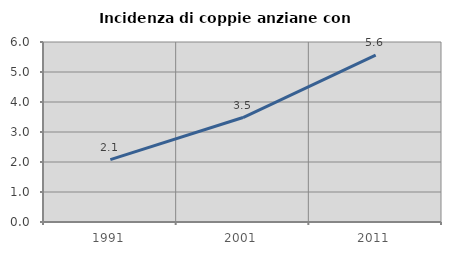
| Category | Incidenza di coppie anziane con figli |
|---|---|
| 1991.0 | 2.079 |
| 2001.0 | 3.482 |
| 2011.0 | 5.564 |